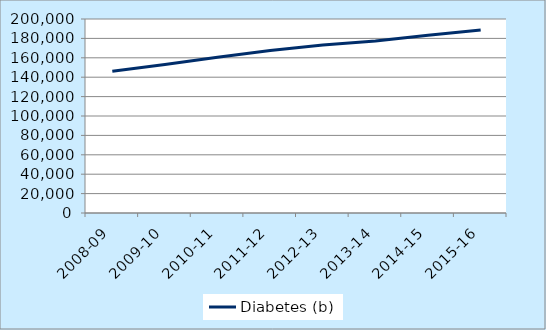
| Category | Diabetes (b) |
|---|---|
| 2008-09 | 146173 |
| 2009-10 | 153175 |
| 2010-11 | 160533 |
| 2011-12 | 167537 |
| 2012-13 | 173299 |
| 2013-14 | 177212 |
| 2014-15 | 183348 |
| 2015-16 | 188644 |